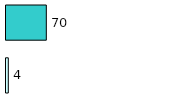
| Category | Series 0 | Series 1 |
|---|---|---|
| 0 | 4 | 70 |